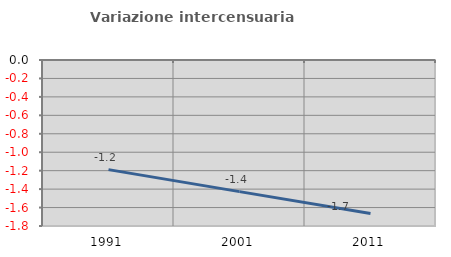
| Category | Variazione intercensuaria annua |
|---|---|
| 1991.0 | -1.189 |
| 2001.0 | -1.427 |
| 2011.0 | -1.666 |